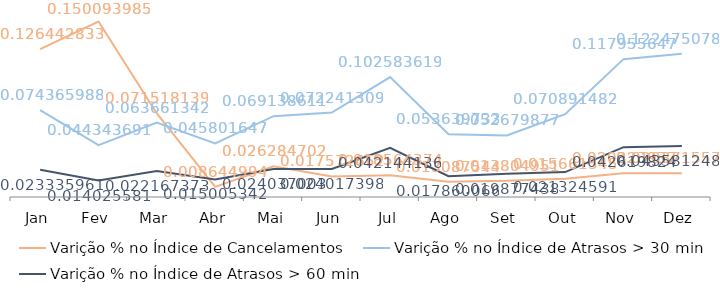
| Category | Varição % no Índice de Cancelamentos | Varição % no Índice de Atrasos > 30 min | Varição % no Índice de Atrasos > 60 min |
|---|---|---|---|
| Jan | 0.126 | 0.074 | 0.023 |
| Fev | 0.15 | 0.044 | 0.014 |
| Mar | 0.072 | 0.064 | 0.022 |
| Abr | 0.009 | 0.046 | 0.015 |
| Mai | 0.026 | 0.069 | 0.024 |
| Jun | 0.018 | 0.072 | 0.024 |
| Jul | 0.019 | 0.103 | 0.042 |
| Ago | 0.013 | 0.054 | 0.018 |
| Set | 0.014 | 0.053 | 0.02 |
| Out | 0.016 | 0.071 | 0.021 |
| Nov | 0.02 | 0.118 | 0.043 |
| Dez | 0.02 | 0.122 | 0.044 |